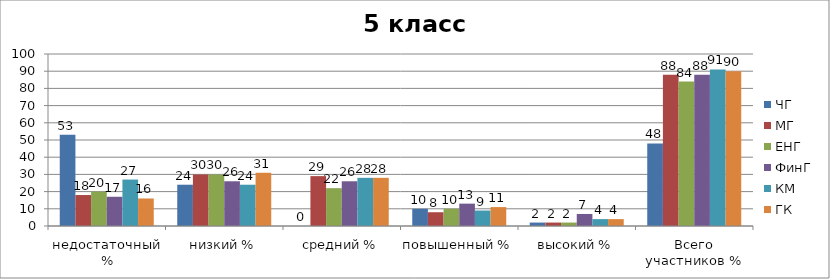
| Category | ЧГ | МГ | ЕНГ | ФинГ | КМ | ГК |
|---|---|---|---|---|---|---|
| недостаточный % | 53 | 18 | 20 | 17 | 27 | 16 |
| низкий % | 24 | 30 | 30 | 26 | 24 | 31 |
| средний % | 0 | 29 | 22 | 26 | 28 | 28 |
| повышенный % | 10 | 8 | 10 | 13 | 9 | 11 |
| высокий % | 2 | 2 | 2 | 7 | 4 | 4 |
| Всего участников % | 48 | 88 | 84 | 88 | 91 | 90 |